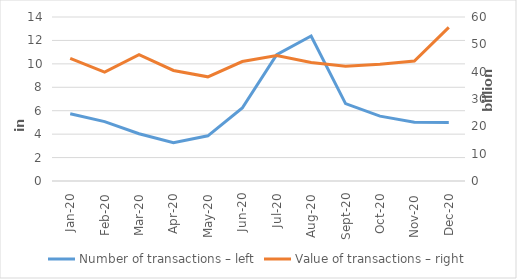
| Category | Number of transactions – left |
|---|---|
| sij.20 | 5746583 |
| Feb-20 | 5070021 |
| ožu.20 | 4032576 |
| tra.20 | 3273476 |
| svi.20 | 3855149 |
| lip.20 | 6231192 |
| srp.20 | 10790819 |
| kol.20 | 12374701 |
| ruj.20 | 6608532 |
| lis.20 | 5534364 |
| stu.20 | 5017302 |
| pro.20 | 5000660 |